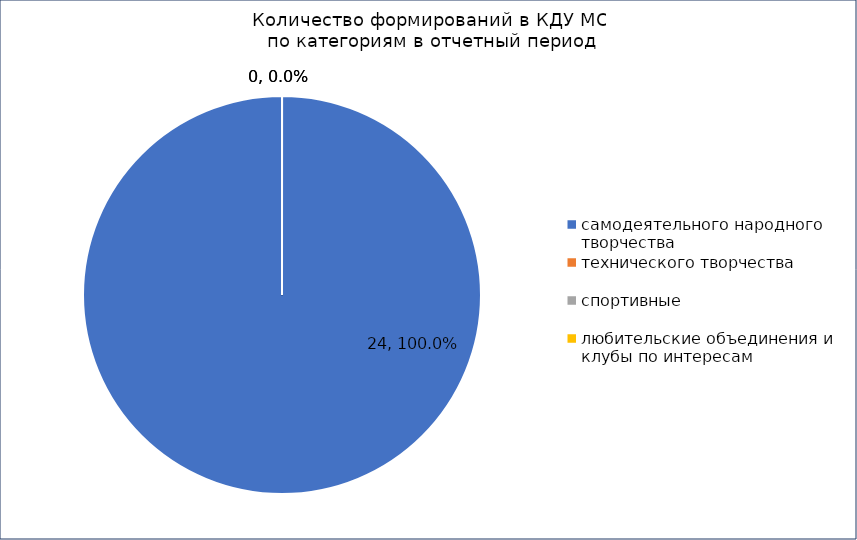
| Category | Series 2 |
|---|---|
| самодеятельного народного творчества | 24 |
| технического творчества | 0 |
| спортивные | 0 |
| любительские объединения и клубы по интересам | 0 |